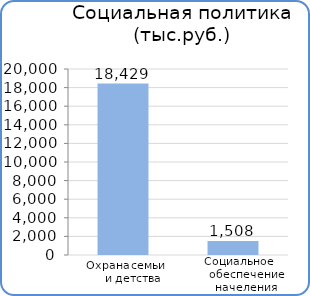
| Category | Расходы |
|---|---|
| Охрана семьи и детства | 18429400 |
| Социальное обеспечение населения | 1508400 |